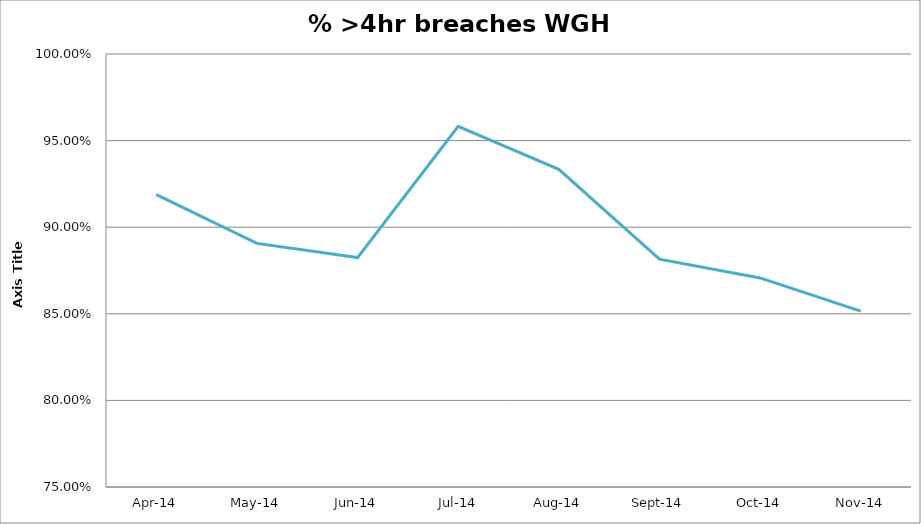
| Category | % >4hr breaches WGH AE |
|---|---|
| 2014-04-01 | 0.919 |
| 2014-05-01 | 0.891 |
| 2014-06-01 | 0.882 |
| 2014-07-01 | 0.958 |
| 2014-08-01 | 0.933 |
| 2014-09-01 | 0.882 |
| 2014-10-01 | 0.871 |
| 2014-11-01 | 0.852 |